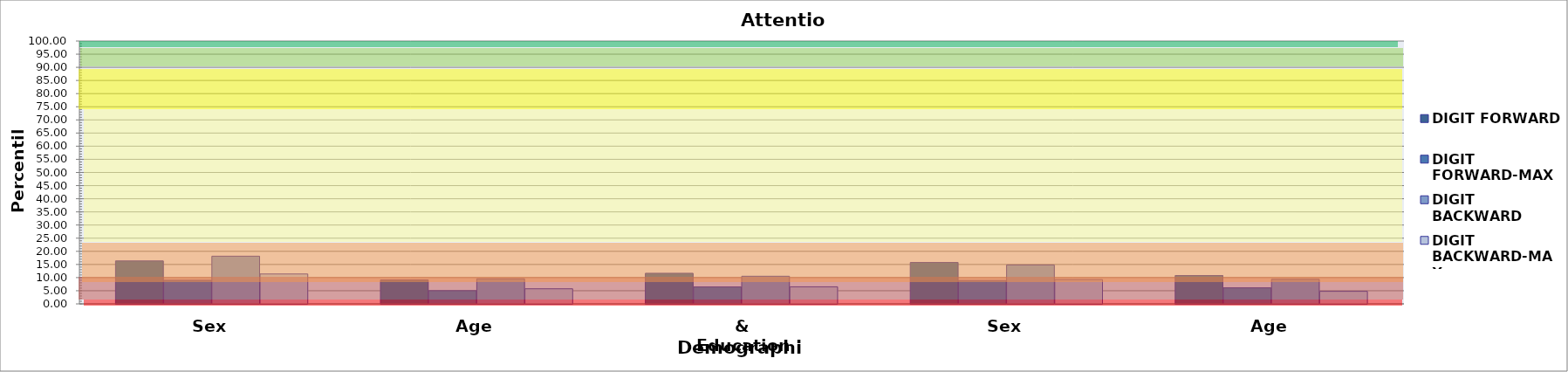
| Category | DIGIT FORWARD | DIGIT FORWARD-MAX | DIGIT BACKWARD | DIGIT BACKWARD-MAX |
|---|---|---|---|---|
| 0 | 16.356 | 8.997 | 18.147 | 11.381 |
| 1 | 9.122 | 5.029 | 9.54 | 5.751 |
| 2 | 11.657 | 6.451 | 10.52 | 6.503 |
| 3 | 15.765 | 8.9 | 14.823 | 9.242 |
| 4 | 10.784 | 6.112 | 9.372 | 4.779 |